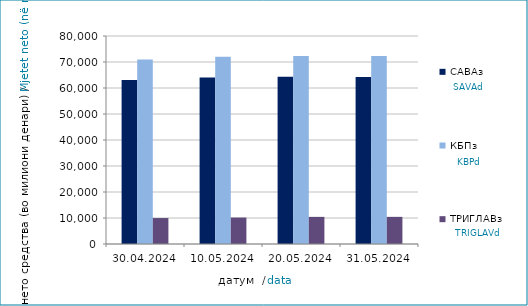
| Category | САВАз | КБПз | ТРИГЛАВз |
|---|---|---|---|
| 2024-04-30 | 63081.662 | 70934.328 | 9986.195 |
| 2024-05-10 | 64001.539 | 72002.031 | 10170.845 |
| 2024-05-20 | 64306.091 | 72334.161 | 10433.811 |
| 2024-05-31 | 64255.388 | 72282.842 | 10439.624 |